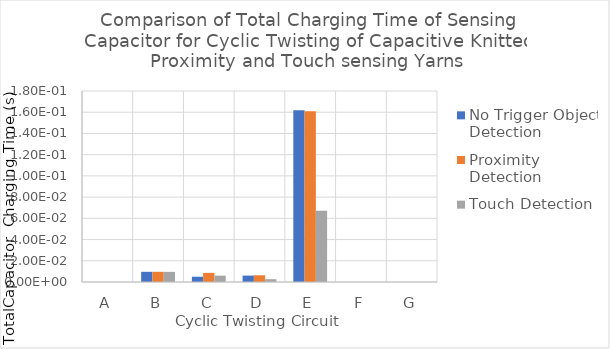
| Category | No Trigger Object Detection | Proximity Detection | Touch Detection |
|---|---|---|---|
| A | 0 | 0 | 0 |
| B | 0.01 | 0.01 | 0.01 |
| C | 0.005 | 0.009 | 0.006 |
| D | 0.006 | 0.006 | 0.003 |
| E | 0.162 | 0.161 | 0.067 |
| F | 0 | 0 | 0 |
| G | 0 | 0 | 0 |